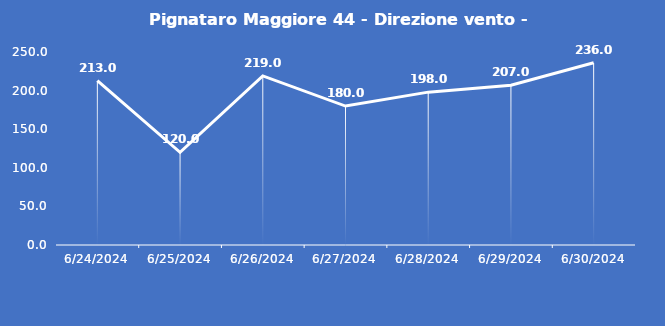
| Category | Pignataro Maggiore 44 - Direzione vento - Grezzo (°N) |
|---|---|
| 6/24/24 | 213 |
| 6/25/24 | 120 |
| 6/26/24 | 219 |
| 6/27/24 | 180 |
| 6/28/24 | 198 |
| 6/29/24 | 207 |
| 6/30/24 | 236 |